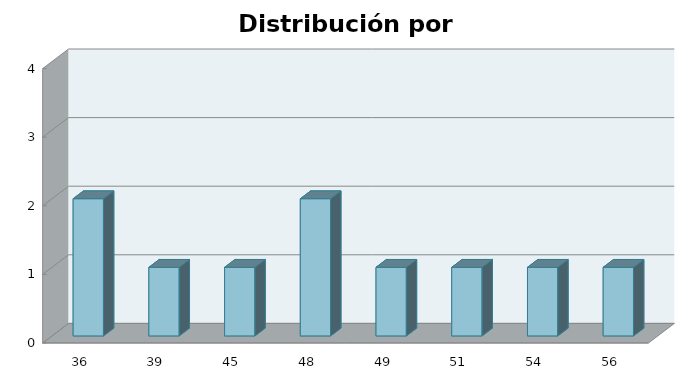
| Category | Series 1 |
|---|---|
| 36.0 | 2 |
| 39.0 | 1 |
| 45.0 | 1 |
| 48.0 | 2 |
| 49.0 | 1 |
| 51.0 | 1 |
| 54.0 | 1 |
| 56.0 | 1 |